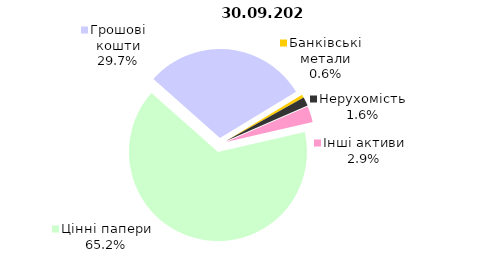
| Category | Всього |
|---|---|
| Цінні папери | 1502.607 |
| Грошові кошти | 685.913 |
| Банківські метали | 13.464 |
| Нерухомість | 36.273 |
| Інші активи | 67.671 |